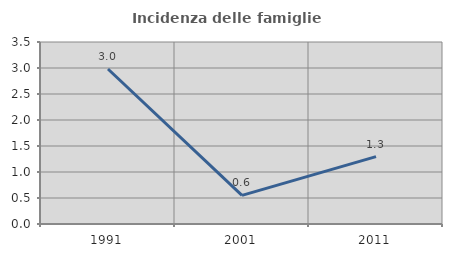
| Category | Incidenza delle famiglie numerose |
|---|---|
| 1991.0 | 2.98 |
| 2001.0 | 0.55 |
| 2011.0 | 1.295 |